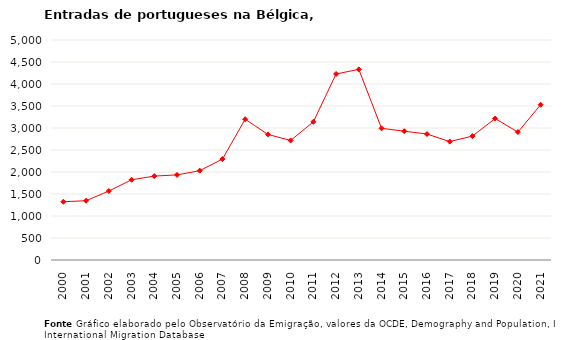
| Category | Entradas |
|---|---|
| 2000.0 | 1324 |
| 2001.0 | 1347 |
| 2002.0 | 1567 |
| 2003.0 | 1823 |
| 2004.0 | 1907 |
| 2005.0 | 1934 |
| 2006.0 | 2030 |
| 2007.0 | 2293 |
| 2008.0 | 3200 |
| 2009.0 | 2854 |
| 2010.0 | 2717 |
| 2011.0 | 3140 |
| 2012.0 | 4228 |
| 2013.0 | 4332 |
| 2014.0 | 2993 |
| 2015.0 | 2927 |
| 2016.0 | 2863 |
| 2017.0 | 2691 |
| 2018.0 | 2816 |
| 2019.0 | 3215 |
| 2020.0 | 2907 |
| 2021.0 | 3529 |